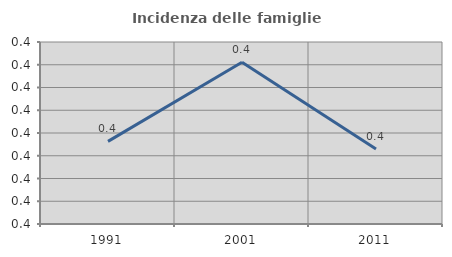
| Category | Incidenza delle famiglie numerose |
|---|---|
| 1991.0 | 0.408 |
| 2001.0 | 0.426 |
| 2011.0 | 0.407 |